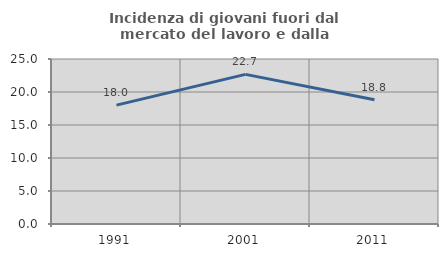
| Category | Incidenza di giovani fuori dal mercato del lavoro e dalla formazione  |
|---|---|
| 1991.0 | 18.005 |
| 2001.0 | 22.673 |
| 2011.0 | 18.815 |